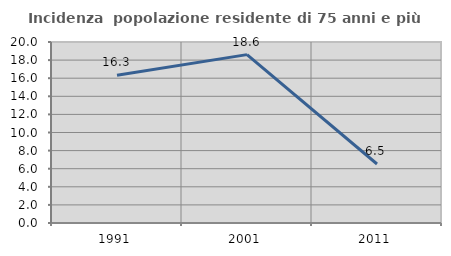
| Category | Incidenza  popolazione residente di 75 anni e più |
|---|---|
| 1991.0 | 16.327 |
| 2001.0 | 18.605 |
| 2011.0 | 6.522 |